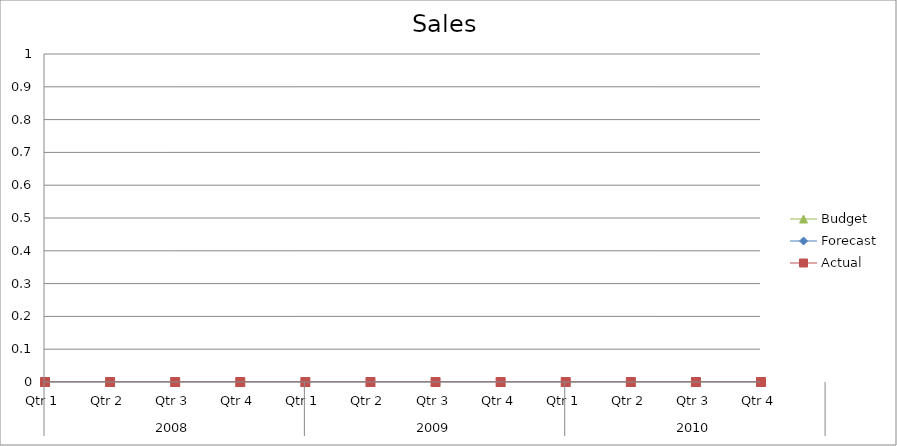
| Category | Budget | Forecast | Actual |
|---|---|---|---|
| 0 | 3130 | 2410 | 1850 |
| 1 | 1770 | 1400 | 1830 |
| 2 | 2530 | 570 | 1220 |
| 3 | 1650 | 1710 | 960 |
| 4 | 960 | 2750 | 2420 |
| 5 | 800 | 3100 | 2310 |
| 6 | 3350 | 640 | 2030 |
| 7 | 2220 | 3420 | 2240 |
| 8 | 3310 | 1310 | 3290 |
| 9 | 1640 | 1840 | 1450 |
| 10 | 2950 | 1220 | 3400 |
| 11 | 2140 | 630 | 2430 |